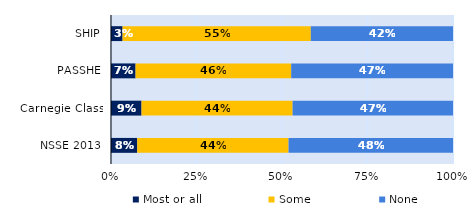
| Category | Most or all | Some | None |
|---|---|---|---|
| SHIP | 0.034 | 0.55 | 0.416 |
| PASSHE | 0.072 | 0.455 | 0.473 |
| Carnegie Class | 0.089 | 0.442 | 0.469 |
| NSSE 2013 | 0.077 | 0.442 | 0.481 |